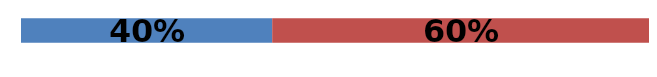
| Category | Series 0 | Series 1 | Series 2 |
|---|---|---|---|
| 0 | 0.4 | 0.6 | 0 |